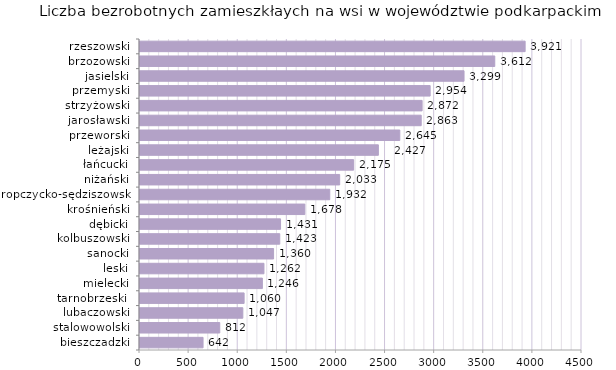
| Category | Liczba bezrobotnych zamieszkłaych na wsi w województwie podkarpackim |
|---|---|
| bieszczadzki | 642 |
| stalowowolski | 812 |
| lubaczowski | 1047 |
| tarnobrzeski  | 1060 |
| mielecki | 1246 |
| leski | 1262 |
| sanocki | 1360 |
| kolbuszowski | 1423 |
| dębicki | 1431 |
| krośnieński | 1678 |
| ropczycko-sędziszowski | 1932 |
| niżański | 2033 |
| łańcucki | 2175 |
| leżajski | 2427 |
| przeworski | 2645 |
| jarosławski | 2863 |
| strzyżowski | 2872 |
| przemyski | 2954 |
| jasielski | 3299 |
| brzozowski | 3612 |
| rzeszowski | 3921 |